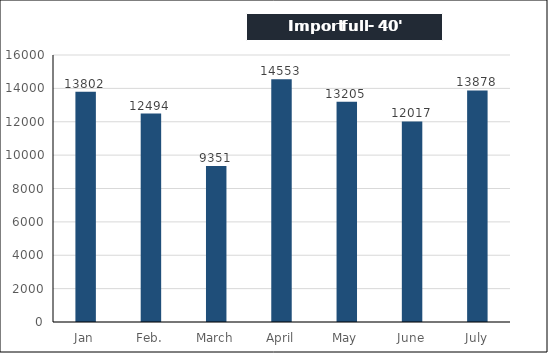
| Category | Import full - 40' |
|---|---|
| Jan | 13802 |
| Feb. | 12494 |
| March | 9351 |
| April | 14553 |
| May | 13205 |
| June | 12017 |
| July | 13878 |